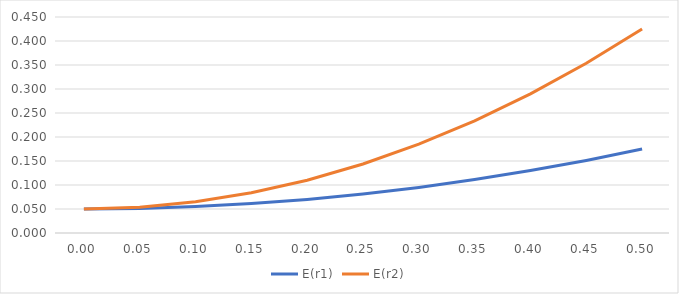
| Category | E(r1) | E(r2) |
|---|---|---|
| 0.0 | 0.05 | 0.05 |
| 0.05 | 0.051 | 0.054 |
| 0.1 | 0.055 | 0.065 |
| 0.15 | 0.061 | 0.084 |
| 0.2 | 0.07 | 0.11 |
| 0.25 | 0.081 | 0.144 |
| 0.3 | 0.095 | 0.185 |
| 0.35 | 0.111 | 0.234 |
| 0.4 | 0.13 | 0.29 |
| 0.45 | 0.151 | 0.354 |
| 0.5 | 0.175 | 0.425 |